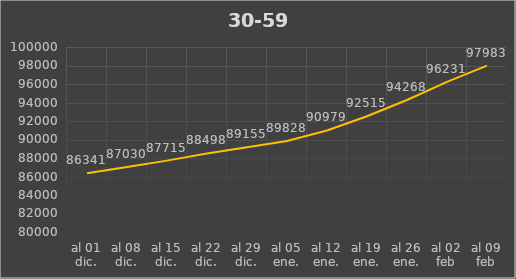
| Category | 30-59 |
|---|---|
| al 01 dic. | 86341 |
| al 08 dic. | 87030 |
| al 15 dic. | 87715 |
| al 22 dic. | 88498 |
| al 29 dic. | 89155 |
| al 05 ene. | 89828 |
| al 12 ene. | 90979 |
| al 19 ene. | 92515 |
| al 26 ene. | 94268 |
| al 02 feb | 96231 |
| al 09 feb | 97983 |